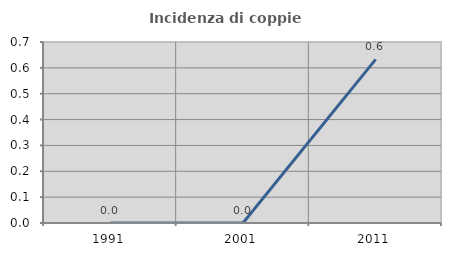
| Category | Incidenza di coppie miste |
|---|---|
| 1991.0 | 0 |
| 2001.0 | 0 |
| 2011.0 | 0.633 |